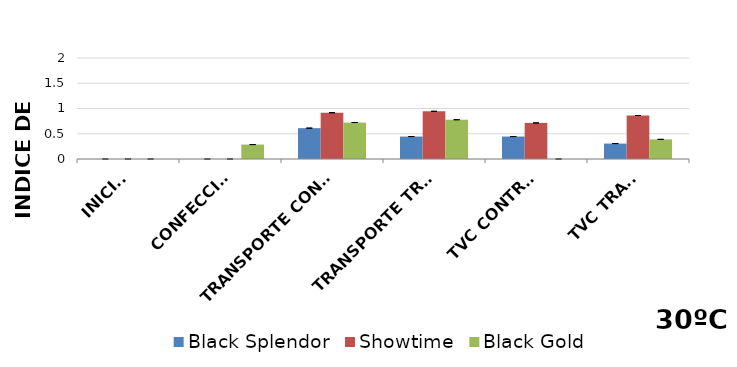
| Category | Black Splendor | Showtime | Black Gold |
|---|---|---|---|
| INICIAL | 0 | 0 | 0 |
| CONFECCIÓN | 0 | 0 | 0.286 |
|  TRANSPORTE CONTROL | 0.611 | 0.917 | 0.722 |
| TRANSPORTE TRAT. | 0.444 | 0.944 | 0.778 |
| TVC CONTROL | 0.444 | 0.714 | 0 |
| TVC TRAT. | 0.306 | 0.861 | 0.389 |